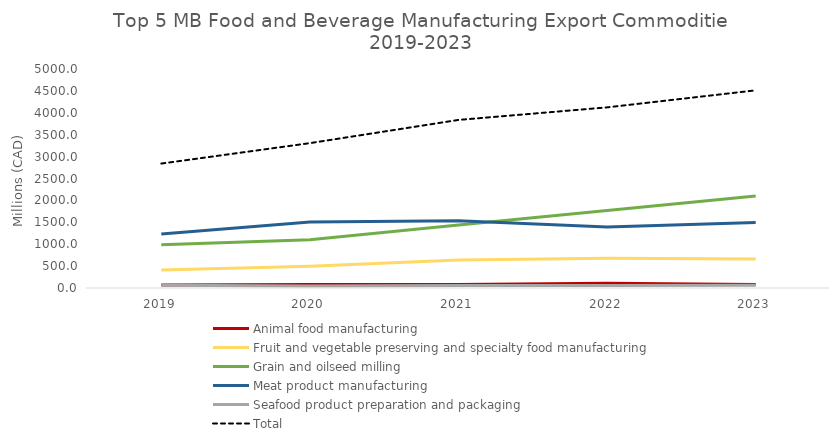
| Category | Animal food manufacturing | Fruit and vegetable preserving and specialty food manufacturing | Grain and oilseed milling | Meat product manufacturing | Seafood product preparation and packaging | Total |
|---|---|---|---|---|---|---|
| 2019.0 | 68.978 | 409.947 | 990.008 | 1231.748 | 60.631 | 2840.936 |
| 2020.0 | 81.714 | 495.414 | 1101.154 | 1509.508 | 47.479 | 3307.446 |
| 2021.0 | 80.104 | 637.819 | 1440.954 | 1534.317 | 55.475 | 3837.377 |
| 2022.0 | 106.56 | 680.178 | 1770.083 | 1392.271 | 56.589 | 4123.942 |
| 2023.0 | 78.914 | 659.5 | 2101.559 | 1498.245 | 63.73 | 4512.716 |